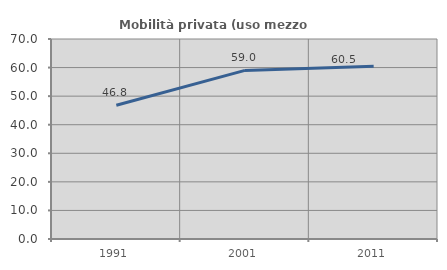
| Category | Mobilità privata (uso mezzo privato) |
|---|---|
| 1991.0 | 46.806 |
| 2001.0 | 59.003 |
| 2011.0 | 60.496 |